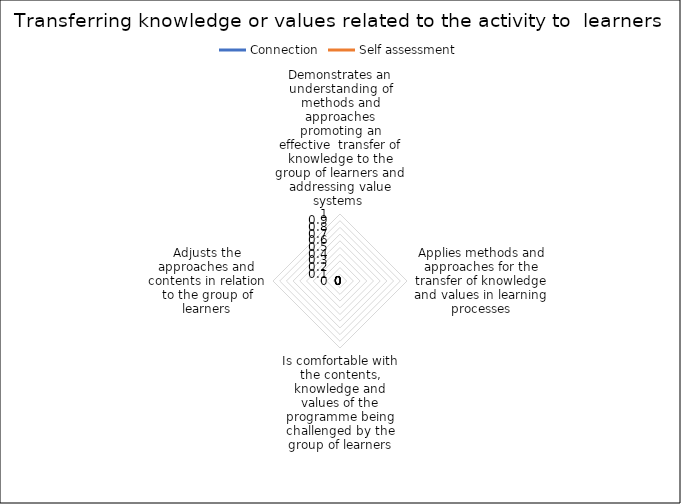
| Category | Connection | Self assessment |
|---|---|---|
| Demonstrates an understanding of methods and approaches promoting an effective  transfer of knowledge to the group of learners and addressing value systems  | 0 | 0 |
| Applies methods and approaches for the transfer of knowledge and values in learning processes | 0 | 0 |
| Is comfortable with the contents, knowledge and values of the programme being challenged by the group of learners | 0 | 0 |
| Adjusts the approaches and contents in relation to the group of learners | 0 | 0 |